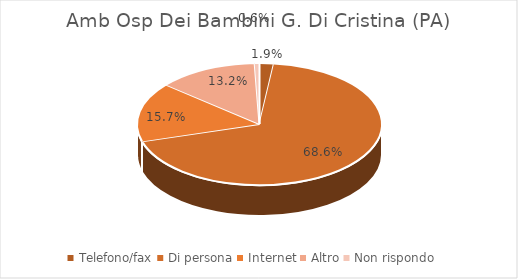
| Category | Amb Osp Dei Bambini G. Di Cristina (PA) |
|---|---|
| Telefono/fax | 0.019 |
| Di persona | 0.686 |
| Internet | 0.157 |
| Altro | 0.132 |
| Non rispondo | 0.006 |